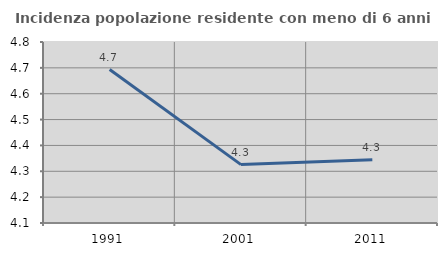
| Category | Incidenza popolazione residente con meno di 6 anni |
|---|---|
| 1991.0 | 4.693 |
| 2001.0 | 4.326 |
| 2011.0 | 4.345 |